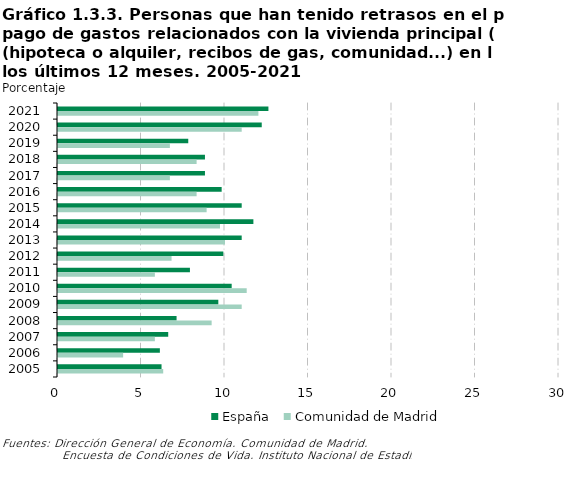
| Category | España | Comunidad de Madrid |
|---|---|---|
| 2021 | 12.6 | 12 |
| 2020 | 12.2 | 11 |
| 2019 | 7.8 | 6.7 |
| 2018 | 8.8 | 8.3 |
| 2017 | 8.8 | 6.7 |
| 2016 | 9.8 | 8.3 |
| 2015 | 11 | 8.9 |
| 2014 | 11.7 | 9.7 |
| 2013 | 11 | 10 |
| 2012 | 9.9 | 6.8 |
| 2011 | 7.9 | 5.8 |
| 2010 | 10.4 | 11.3 |
| 2009 | 9.6 | 11 |
| 2008 | 7.1 | 9.2 |
| 2007 | 6.6 | 5.8 |
| 2006 | 6.1 | 3.9 |
| 2005 | 6.2 | 6.3 |